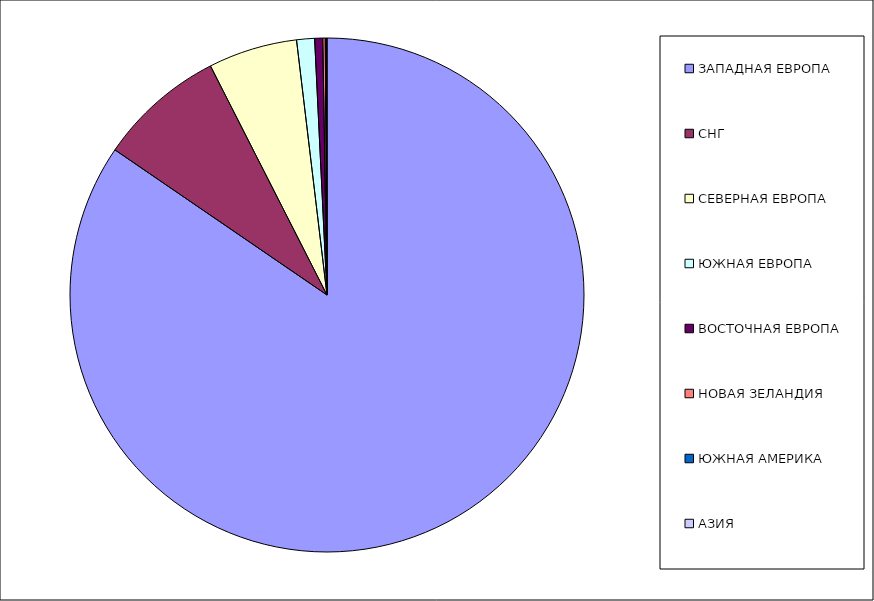
| Category | Оборот |
|---|---|
| ЗАПАДНАЯ ЕВРОПА | 0.846 |
| СНГ | 0.08 |
| СЕВЕРНАЯ ЕВРОПА | 0.056 |
| ЮЖНАЯ ЕВРОПА | 0.011 |
| ВОСТОЧНАЯ ЕВРОПА | 0.005 |
| НОВАЯ ЗЕЛАНДИЯ | 0.002 |
| ЮЖНАЯ АМЕРИКА | 0.001 |
| АЗИЯ | 0 |